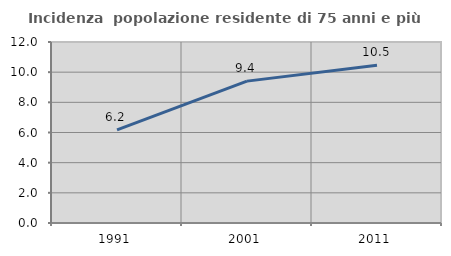
| Category | Incidenza  popolazione residente di 75 anni e più |
|---|---|
| 1991.0 | 6.176 |
| 2001.0 | 9.406 |
| 2011.0 | 10.463 |